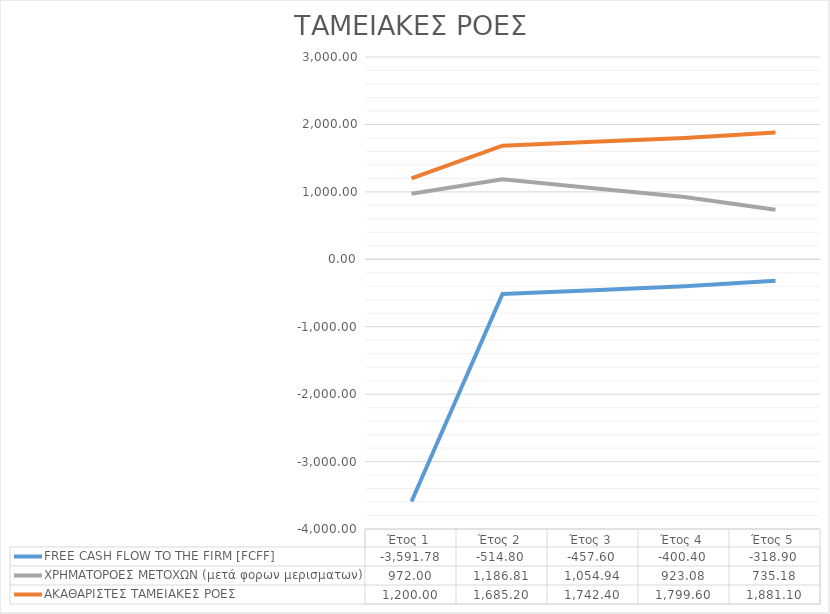
| Category | FREE CASH FLOW TO THE FIRM [FCFF] | ΧΡΗΜΑΤΟΡΟΕΣ ΜΕΤΟΧΩΝ (μετά φορων μερισματων) | ΑΚΑΘΑΡΙΣΤΕΣ ΤΑΜΕΙΑΚΕΣ ΡΟΕΣ |
|---|---|---|---|
| Έτος 1 | -3591.781 | 972 | 1200 |
| Έτος 2 | -514.8 | 1186.812 | 1685.2 |
| Έτος 3 | -457.6 | 1054.944 | 1742.4 |
| Έτος 4 | -400.4 | 923.076 | 1799.6 |
| Έτος 5 | -318.895 | 735.176 | 1881.105 |